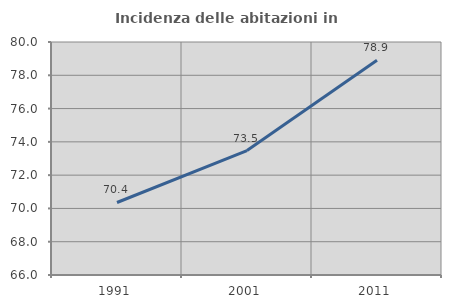
| Category | Incidenza delle abitazioni in proprietà  |
|---|---|
| 1991.0 | 70.357 |
| 2001.0 | 73.478 |
| 2011.0 | 78.903 |